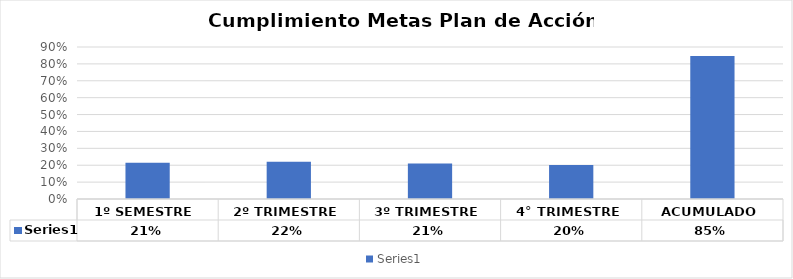
| Category | Series 0 |
|---|---|
| 1º SEMESTRE | 0.214 |
| 2º TRIMESTRE | 0.221 |
| 3º TRIMESTRE | 0.21 |
| 4° TRIMESTRE | 0.202 |
| ACUMULADO | 0.846 |